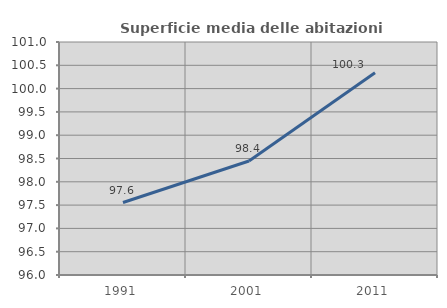
| Category | Superficie media delle abitazioni occupate |
|---|---|
| 1991.0 | 97.556 |
| 2001.0 | 98.446 |
| 2011.0 | 100.339 |